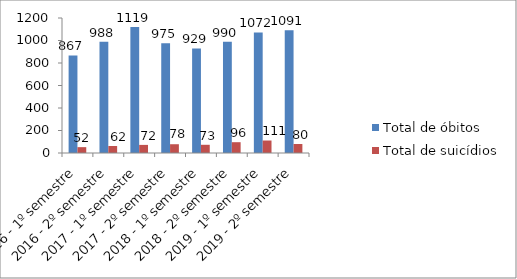
| Category | Total de óbitos | Total de suicídios |
|---|---|---|
| 2016 - 1º semestre | 867 | 52 |
| 2016 - 2º semestre | 988 | 62 |
| 2017 - 1º semestre | 1119 | 72 |
| 2017 - 2º semestre | 975 | 78 |
| 2018 - 1º semestre | 929 | 73 |
| 2018 - 2º semestre | 990 | 96 |
| 2019 - 1º semestre | 1072 | 111 |
| 2019 - 2º semestre | 1091 | 80 |